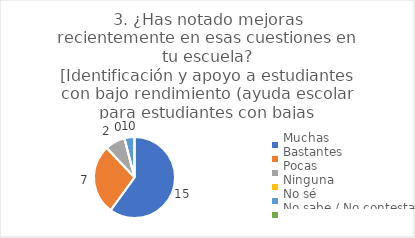
| Category | 3. ¿Has notado mejoras recientemente en esas cuestiones en tu escuela?
[Identificación y apoyo a estudiantes con bajo rendimiento (ayuda escolar para estudiantes con bajas calificaciones)] |
|---|---|
| Muchas  | 0.6 |
| Bastantes  | 0.28 |
| Pocas  | 0.08 |
| Ninguna  | 0 |
| No sé  | 0.04 |
| No sabe / No contesta | 0 |